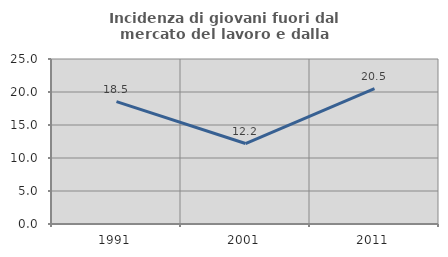
| Category | Incidenza di giovani fuori dal mercato del lavoro e dalla formazione  |
|---|---|
| 1991.0 | 18.545 |
| 2001.0 | 12.195 |
| 2011.0 | 20.5 |